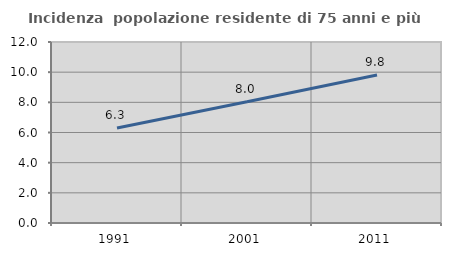
| Category | Incidenza  popolazione residente di 75 anni e più |
|---|---|
| 1991.0 | 6.302 |
| 2001.0 | 8.044 |
| 2011.0 | 9.818 |